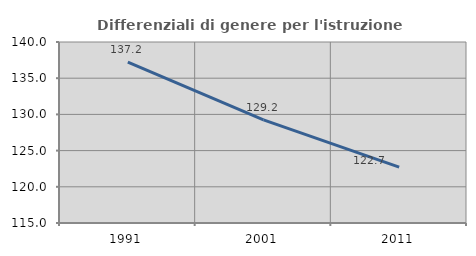
| Category | Differenziali di genere per l'istruzione superiore |
|---|---|
| 1991.0 | 137.216 |
| 2001.0 | 129.249 |
| 2011.0 | 122.722 |